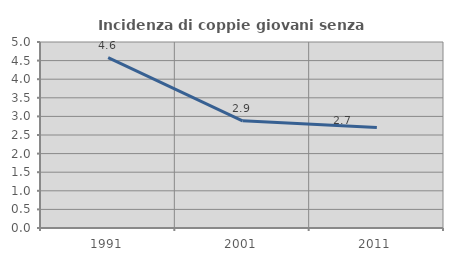
| Category | Incidenza di coppie giovani senza figli |
|---|---|
| 1991.0 | 4.578 |
| 2001.0 | 2.882 |
| 2011.0 | 2.703 |